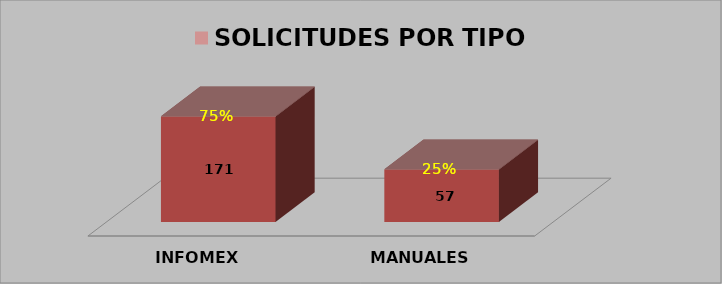
| Category | SOLICITUDES POR TIPO |
|---|---|
| INFOMEX | 0.666 |
| MANUALES | 0.331 |